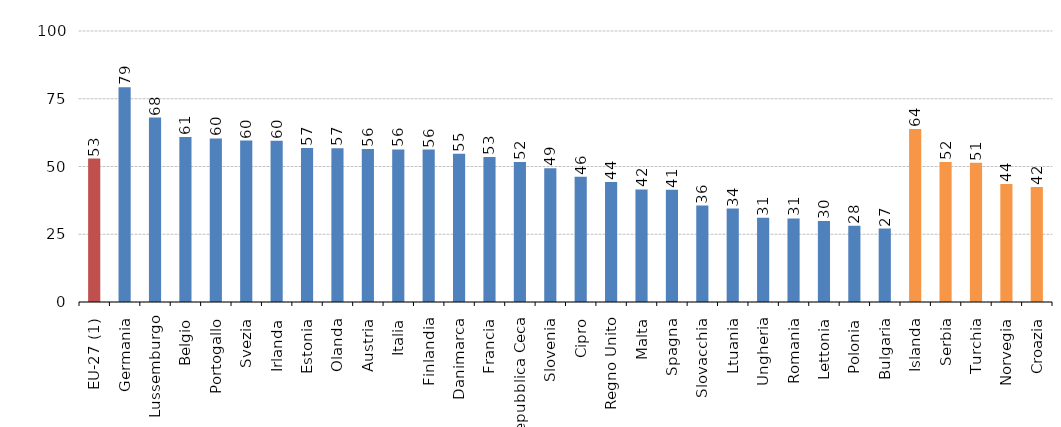
| Category | Series 0 |
|---|---|
| EU-27 (1) | 52.94 |
| Germania | 79.28 |
| Lussemburgo | 68.06 |
| Belgio | 60.88 |
| Portogallo | 60.34 |
| Svezia | 59.58 |
| Irlanda | 59.54 |
| Estonia | 56.84 |
| Olanda | 56.72 |
| Austria | 56.46 |
| Italia | 56.3 |
| Finlandia | 56.23 |
| Danimarca | 54.74 |
| Francia | 53.48 |
| Repubblica Ceca | 51.69 |
| Slovenia | 49.4 |
| Cipro | 46.19 |
| Regno Unito | 44.29 |
| Malta | 41.54 |
| Spagna | 41.38 |
| Slovacchia | 35.59 |
| Ltuania | 34.46 |
| Ungheria | 31.06 |
| Romania | 30.82 |
| Lettonia | 29.86 |
| Polonia | 28.14 |
| Bulgaria | 27.11 |
| Islanda | 63.83 |
| Serbia | 51.68 |
| Turchia | 51.36 |
| Norvegia | 43.54 |
| Croazia | 42.43 |